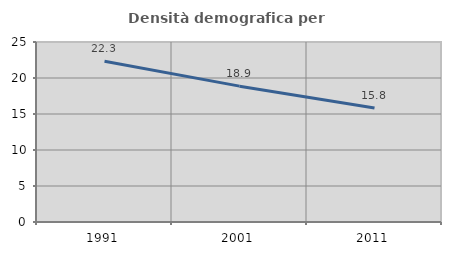
| Category | Densità demografica |
|---|---|
| 1991.0 | 22.323 |
| 2001.0 | 18.868 |
| 2011.0 | 15.831 |